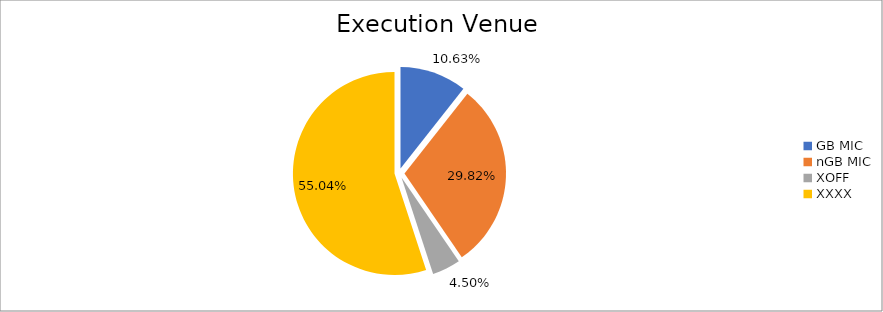
| Category | Series 0 |
|---|---|
| GB MIC | 1036046.355 |
| nGB MIC | 2905431.401 |
| XOFF | 438930.363 |
| XXXX | 5363420.108 |